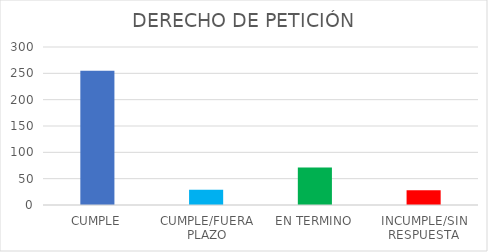
| Category | Series 0 |
|---|---|
| CUMPLE | 255 |
| CUMPLE/FUERA PLAZO | 29 |
| EN TERMINO | 71 |
| INCUMPLE/SIN RESPUESTA | 28 |